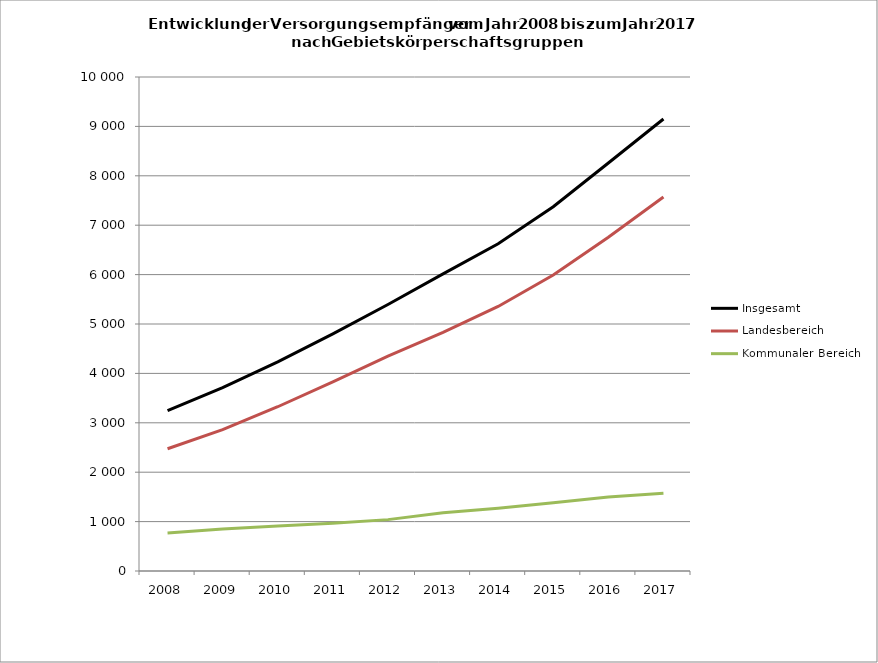
| Category | Insgesamt | Landesbereich | Kommunaler Bereich |
|---|---|---|---|
| 2008.0 | 3245 | 2475 | 770 |
| 2009.0 | 3710 | 2860 | 850 |
| 2010.0 | 4235 | 3325 | 910 |
| 2011.0 | 4800 | 3830 | 965 |
| 2012.0 | 5395 | 4350 | 1040 |
| 2013.0 | 6015 | 4830 | 1180 |
| 2014.0 | 6625 | 5355 | 1270 |
| 2015.0 | 7375 | 5990 | 1380 |
| 2016.0 | 8260 | 6755 | 1500 |
| 2017.0 | 9150 | 7570 | 1575 |